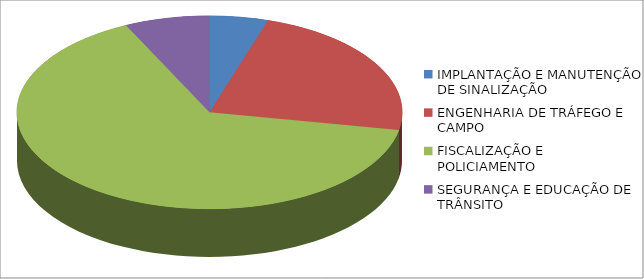
| Category | Series 0 | Series 1 |
|---|---|---|
| IMPLANTAÇÃO E MANUTENÇÃO DE SINALIZAÇÃO | 278536.5 |  |
| ENGENHARIA DE TRÁFEGO E CAMPO | 1306437.17 |  |
| FISCALIZAÇÃO E POLICIAMENTO | 3685776.06 |  |
| SEGURANÇA E EDUCAÇÃO DE TRÂNSITO | 403920.45 |  |